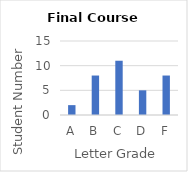
| Category | Series 0 |
|---|---|
| A | 2 |
| B | 8 |
| C | 11 |
| D | 5 |
| F | 8 |